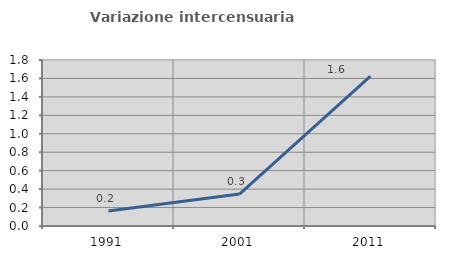
| Category | Variazione intercensuaria annua |
|---|---|
| 1991.0 | 0.162 |
| 2001.0 | 0.346 |
| 2011.0 | 1.626 |